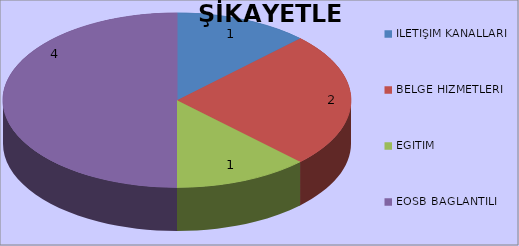
| Category | ADET |
|---|---|
| İLETİŞİM KANALLARI | 1 |
| BELGE HİZMETLERİ | 2 |
| EĞİTİM | 1 |
| EOSB BAĞLANTILI | 4 |